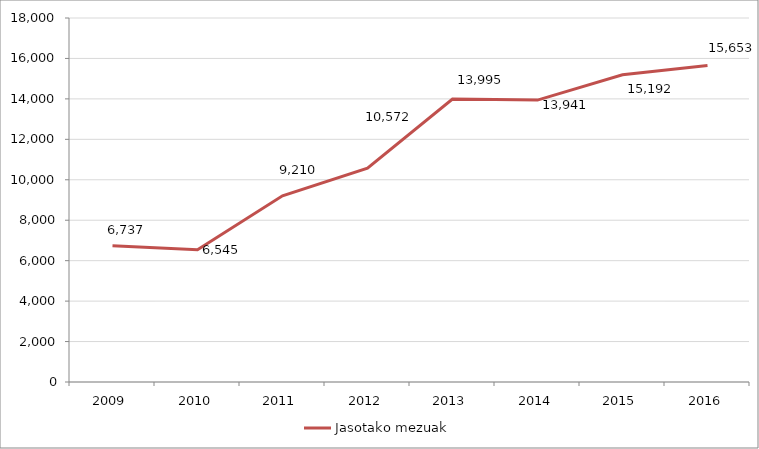
| Category | Jasotako mezuak |
|---|---|
| 2009.0 | 6737 |
| 2010.0 | 6545 |
| 2011.0 | 9210 |
| 2012.0 | 10572 |
| 2013.0 | 13995 |
| 2014.0 | 13941 |
| 2015.0 | 15192 |
| 2016.0 | 15653 |